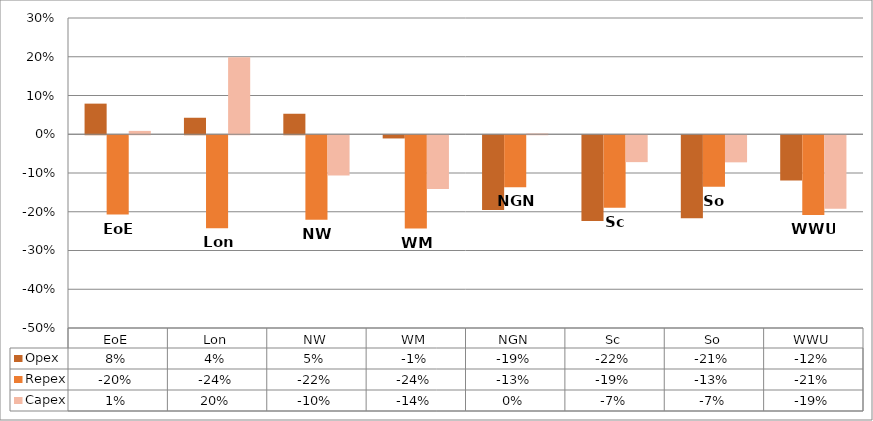
| Category | Opex | Repex | Capex |
|---|---|---|---|
| 0 | 0.079 | -0.205 | 0.009 |
| 1 | 0.043 | -0.24 | 0.199 |
| 2 | 0.053 | -0.218 | -0.104 |
| 3 | -0.008 | -0.241 | -0.139 |
| 4 | -0.193 | -0.134 | 0.002 |
| 5 | -0.222 | -0.187 | -0.069 |
| 6 | -0.214 | -0.133 | -0.07 |
| 7 | -0.117 | -0.206 | -0.19 |